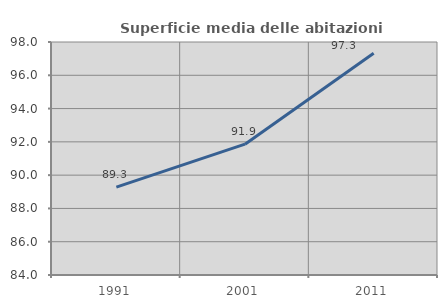
| Category | Superficie media delle abitazioni occupate |
|---|---|
| 1991.0 | 89.281 |
| 2001.0 | 91.859 |
| 2011.0 | 97.329 |